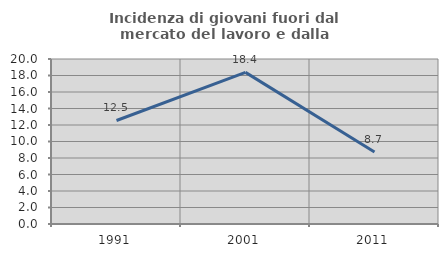
| Category | Incidenza di giovani fuori dal mercato del lavoro e dalla formazione  |
|---|---|
| 1991.0 | 12.546 |
| 2001.0 | 18.378 |
| 2011.0 | 8.725 |